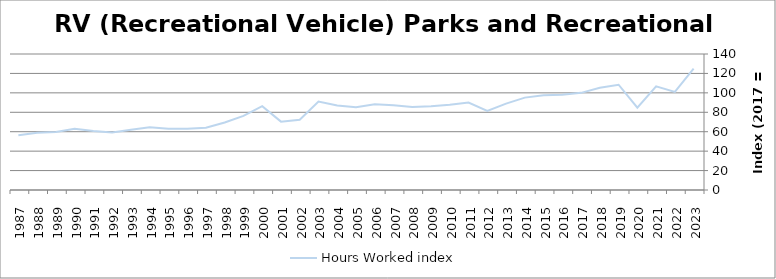
| Category | Hours Worked index |
|---|---|
| 2023.0 | 124.969 |
| 2022.0 | 100.937 |
| 2021.0 | 106.693 |
| 2020.0 | 84.684 |
| 2019.0 | 108.389 |
| 2018.0 | 105.152 |
| 2017.0 | 100 |
| 2016.0 | 97.944 |
| 2015.0 | 97.636 |
| 2014.0 | 95.094 |
| 2013.0 | 88.908 |
| 2012.0 | 81.427 |
| 2011.0 | 90.035 |
| 2010.0 | 87.689 |
| 2009.0 | 86.128 |
| 2008.0 | 85.337 |
| 2007.0 | 87.194 |
| 2006.0 | 88.215 |
| 2005.0 | 85.288 |
| 2004.0 | 86.982 |
| 2003.0 | 91.003 |
| 2002.0 | 72.289 |
| 2001.0 | 70.376 |
| 2000.0 | 86.316 |
| 1999.0 | 76.305 |
| 1998.0 | 69.423 |
| 1997.0 | 64.003 |
| 1996.0 | 63.146 |
| 1995.0 | 63.043 |
| 1994.0 | 64.499 |
| 1993.0 | 62.027 |
| 1992.0 | 59.273 |
| 1991.0 | 60.83 |
| 1990.0 | 62.998 |
| 1989.0 | 59.752 |
| 1988.0 | 58.884 |
| 1987.0 | 56.429 |